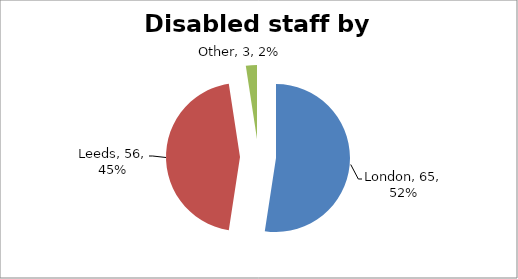
| Category | Yes |
|---|---|
| London | 65 |
| Leeds | 56 |
| Other | 3 |